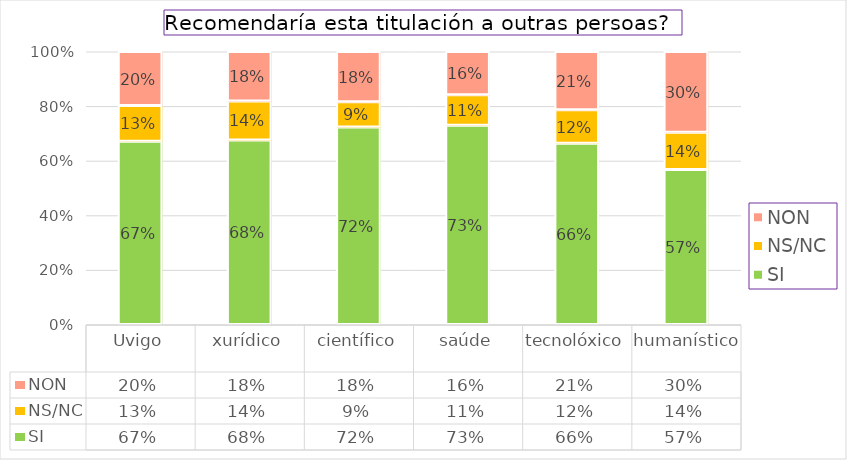
| Category | SI | NS/NC | NON |
|---|---|---|---|
| Uvigo | 0.671 | 0.131 | 0.198 |
| xurídico | 0.676 | 0.143 | 0.181 |
| científico | 0.724 | 0.092 | 0.184 |
| saúde | 0.73 | 0.111 | 0.159 |
| tecnolóxico | 0.664 | 0.122 | 0.214 |
| humanístico | 0.568 | 0.136 | 0.295 |